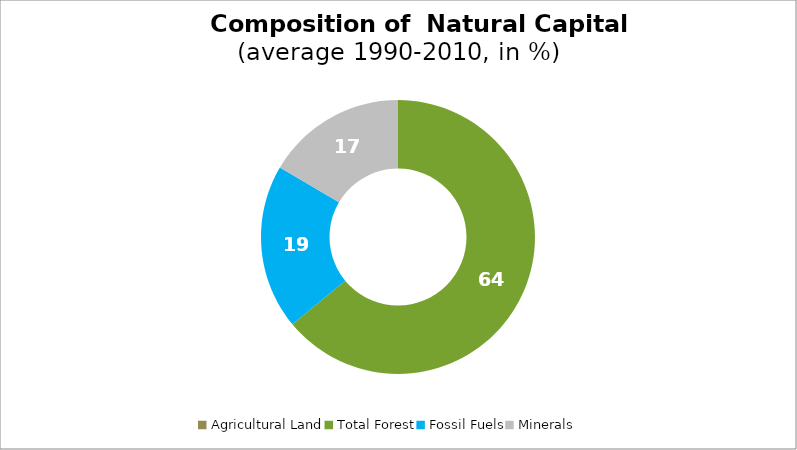
| Category | Series 0 |
|---|---|
| Agricultural Land | 0 |
| Total Forest | 64.004 |
| Fossil Fuels | 19.45 |
| Minerals | 16.546 |